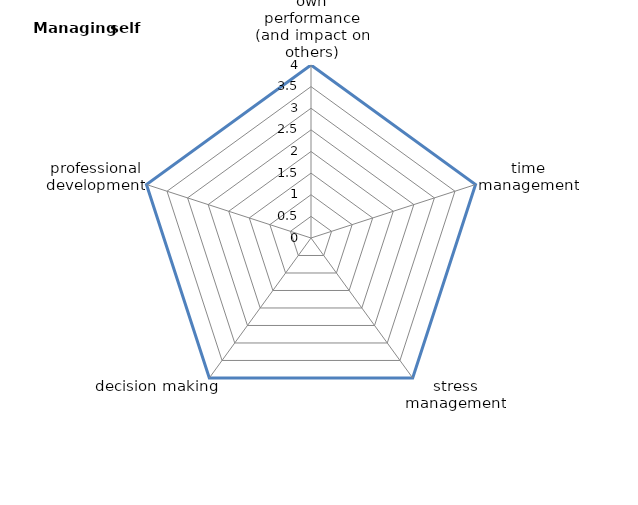
| Category | Series 0 | Series 1 |
|---|---|---|
| reflection on own performance (and impact on others) | 4 | 0 |
| time management | 4 | 0 |
| stress management | 4 | 0 |
| decision making | 4 | 0 |
| professional development | 4 | 0 |